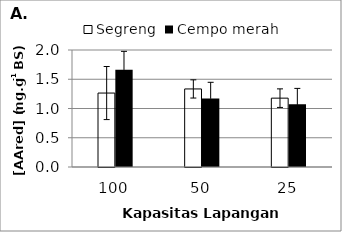
| Category | Segreng | Cempo merah |
|---|---|---|
| 0 | 1.264 | 1.661 |
| 1 | 1.334 | 1.17 |
| 2 | 1.177 | 1.074 |